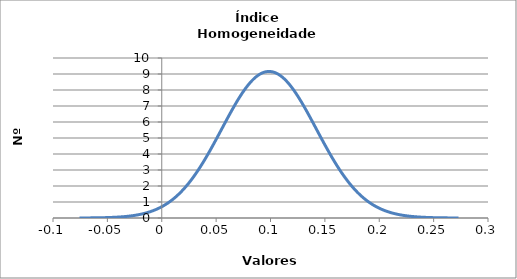
| Category | Series 0 |
|---|---|
| -0.07557970575494334 | 0.003 |
| -0.07205999382421222 | 0.004 |
| -0.06854028189348109 | 0.006 |
| -0.06502056996274996 | 0.008 |
| -0.06150085803201883 | 0.011 |
| -0.0579811461012877 | 0.014 |
| -0.054461434170556565 | 0.019 |
| -0.05094172223982543 | 0.025 |
| -0.0474220103090943 | 0.033 |
| -0.043902298378363167 | 0.043 |
| -0.040382586447632034 | 0.056 |
| -0.0368628745169009 | 0.072 |
| -0.03334316258616977 | 0.093 |
| -0.02982345065543864 | 0.118 |
| -0.02630373872470751 | 0.15 |
| -0.02278402679397638 | 0.188 |
| -0.01926431486324525 | 0.235 |
| -0.01574460293251412 | 0.291 |
| -0.012224891001782992 | 0.359 |
| -0.008705179071051863 | 0.439 |
| -0.0051854671403207325 | 0.534 |
| -0.0016657552095896023 | 0.646 |
| 0.001853956721141528 | 0.775 |
| 0.005373668651872658 | 0.925 |
| 0.008893380582603787 | 1.096 |
| 0.012413092513334917 | 1.29 |
| 0.015932804444066046 | 1.509 |
| 0.019452516374797175 | 1.754 |
| 0.022972228305528305 | 2.025 |
| 0.026491940236259434 | 2.323 |
| 0.030011652166990564 | 2.647 |
| 0.03353136409772169 | 2.996 |
| 0.037051076028452826 | 3.37 |
| 0.04057078795918396 | 3.765 |
| 0.04409049988991509 | 4.18 |
| 0.047610211820646224 | 4.61 |
| 0.05112992375137736 | 5.052 |
| 0.05464963568210849 | 5.499 |
| 0.05816934761283962 | 5.947 |
| 0.061689059543570755 | 6.39 |
| 0.06520877147430189 | 6.822 |
| 0.06872848340503301 | 7.235 |
| 0.07224819533576414 | 7.623 |
| 0.07576790726649527 | 7.979 |
| 0.07928761919722639 | 8.298 |
| 0.08280733112795752 | 8.573 |
| 0.08632704305868864 | 8.8 |
| 0.08984675498941977 | 8.974 |
| 0.0933664669201509 | 9.092 |
| 0.09688617885088202 | 9.152 |
| 0.10040589078161315 | 9.152 |
| 0.10392560271234427 | 9.092 |
| 0.1074453146430754 | 8.974 |
| 0.11096502657380652 | 8.8 |
| 0.11448473850453765 | 8.573 |
| 0.11800445043526878 | 8.298 |
| 0.1215241623659999 | 7.979 |
| 0.12504387429673103 | 7.623 |
| 0.12856358622746217 | 7.235 |
| 0.1320832981581933 | 6.822 |
| 0.13560301008892445 | 6.39 |
| 0.1391227220196556 | 5.947 |
| 0.14264243395038673 | 5.499 |
| 0.14616214588111787 | 5.052 |
| 0.149681857811849 | 4.61 |
| 0.15320156974258015 | 4.18 |
| 0.15672128167331129 | 3.765 |
| 0.16024099360404243 | 3.37 |
| 0.16376070553477357 | 2.996 |
| 0.1672804174655047 | 2.647 |
| 0.17080012939623584 | 2.323 |
| 0.17431984132696698 | 2.025 |
| 0.17783955325769812 | 1.754 |
| 0.18135926518842926 | 1.509 |
| 0.1848789771191604 | 1.29 |
| 0.18839868904989154 | 1.096 |
| 0.19191840098062268 | 0.925 |
| 0.19543811291135382 | 0.775 |
| 0.19895782484208496 | 0.646 |
| 0.2024775367728161 | 0.534 |
| 0.20599724870354724 | 0.439 |
| 0.20951696063427838 | 0.359 |
| 0.21303667256500952 | 0.291 |
| 0.21655638449574066 | 0.235 |
| 0.2200760964264718 | 0.188 |
| 0.22359580835720294 | 0.15 |
| 0.22711552028793408 | 0.118 |
| 0.23063523221866522 | 0.093 |
| 0.23415494414939636 | 0.072 |
| 0.2376746560801275 | 0.056 |
| 0.24119436801085864 | 0.043 |
| 0.24471407994158978 | 0.033 |
| 0.24823379187232092 | 0.025 |
| 0.25175350380305206 | 0.019 |
| 0.2552732157337832 | 0.014 |
| 0.25879292766451434 | 0.011 |
| 0.2623126395952455 | 0.008 |
| 0.2658323515259766 | 0.006 |
| 0.26935206345670776 | 0.004 |
| 0.2728717753874389 | 0.003 |